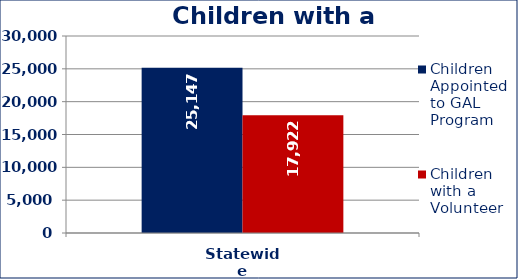
| Category | Children Appointed to GAL Program  | Children with a Volunteer  |
|---|---|---|
| Statewide | 25147 | 17922 |